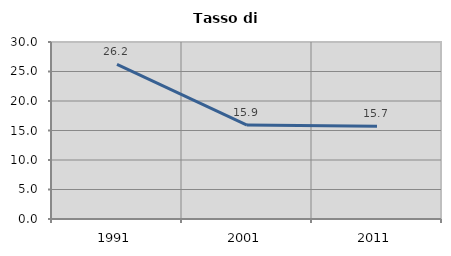
| Category | Tasso di disoccupazione   |
|---|---|
| 1991.0 | 26.213 |
| 2001.0 | 15.923 |
| 2011.0 | 15.706 |